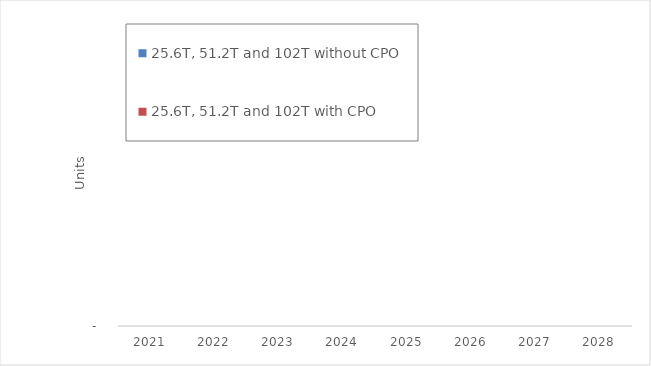
| Category | 25.6T, 51.2T and 102T without CPO | 25.6T, 51.2T and 102T with CPO |
|---|---|---|
| 2021.0 | 0 | 0 |
| 2022.0 | 0 | 0 |
| 2023.0 | 0 | 0 |
| 2024.0 | 0 | 0 |
| 2025.0 | 0 | 0 |
| 2026.0 | 0 | 0 |
| 2027.0 | 0 | 0 |
| 2028.0 | 0 | 0 |